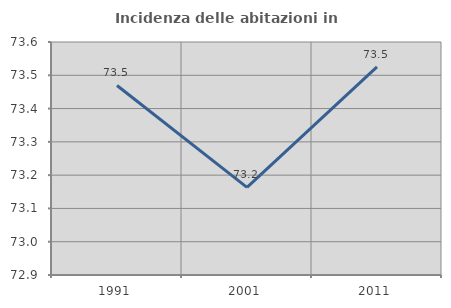
| Category | Incidenza delle abitazioni in proprietà  |
|---|---|
| 1991.0 | 73.469 |
| 2001.0 | 73.163 |
| 2011.0 | 73.526 |